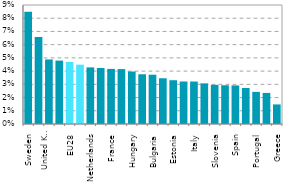
| Category | Series 0 |
|---|---|
| Sweden | 0.085 |
| Finland | 0.066 |
| United Kingdom | 0.049 |
| Germany | 0.048 |
| EU28 | 0.047 |
| Czechia | 0.045 |
| Netherlands | 0.043 |
| Denmark | 0.042 |
| France | 0.042 |
| Slovakia | 0.042 |
| Hungary | 0.04 |
| Romania | 0.038 |
| Bulgaria | 0.037 |
| Austria | 0.035 |
| Estonia | 0.033 |
| Poland | 0.032 |
| Italy | 0.032 |
| Croatia | 0.031 |
| Slovenia | 0.03 |
| Belgium | 0.029 |
| Spain | 0.029 |
| Latvia | 0.027 |
| Portugal | 0.024 |
| Lithuania | 0.024 |
| Greece | 0.015 |